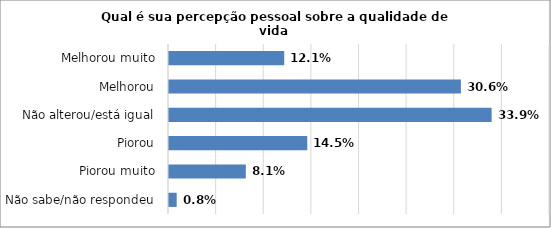
| Category | Series 0 |
|---|---|
| Não sabe/não respondeu | 0.008 |
| Piorou muito | 0.081 |
| Piorou | 0.145 |
| Não alterou/está igual | 0.339 |
| Melhorou | 0.306 |
| Melhorou muito | 0.121 |